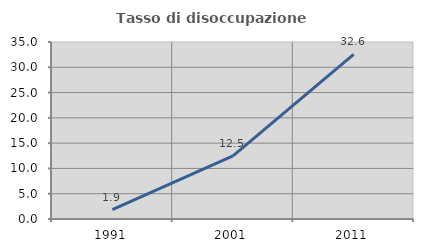
| Category | Tasso di disoccupazione giovanile  |
|---|---|
| 1991.0 | 1.852 |
| 2001.0 | 12.5 |
| 2011.0 | 32.558 |